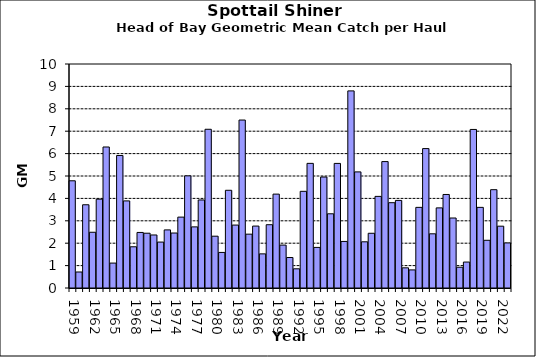
| Category | Series 0 |
|---|---|
| 1959.0 | 4.786 |
| 1960.0 | 0.715 |
| 1961.0 | 3.716 |
| 1962.0 | 2.489 |
| 1963.0 | 3.967 |
| 1964.0 | 6.295 |
| 1965.0 | 1.112 |
| 1966.0 | 5.916 |
| 1967.0 | 3.888 |
| 1968.0 | 1.84 |
| 1969.0 | 2.48 |
| 1970.0 | 2.446 |
| 1971.0 | 2.367 |
| 1972.0 | 2.05 |
| 1973.0 | 2.594 |
| 1974.0 | 2.455 |
| 1975.0 | 3.164 |
| 1976.0 | 5.007 |
| 1977.0 | 2.728 |
| 1978.0 | 3.93 |
| 1979.0 | 7.086 |
| 1980.0 | 2.313 |
| 1981.0 | 1.588 |
| 1982.0 | 4.362 |
| 1983.0 | 2.809 |
| 1984.0 | 7.498 |
| 1985.0 | 2.404 |
| 1986.0 | 2.765 |
| 1987.0 | 1.524 |
| 1988.0 | 2.826 |
| 1989.0 | 4.191 |
| 1990.0 | 1.916 |
| 1991.0 | 1.361 |
| 1992.0 | 0.857 |
| 1993.0 | 4.316 |
| 1994.0 | 5.564 |
| 1995.0 | 1.812 |
| 1996.0 | 4.954 |
| 1997.0 | 3.313 |
| 1998.0 | 5.562 |
| 1999.0 | 2.079 |
| 2000.0 | 8.799 |
| 2001.0 | 5.183 |
| 2002.0 | 2.063 |
| 2003.0 | 2.443 |
| 2004.0 | 4.09 |
| 2005.0 | 5.644 |
| 2006.0 | 3.809 |
| 2007.0 | 3.91 |
| 2008.0 | 0.901 |
| 2009.0 | 0.808 |
| 2010.0 | 3.6 |
| 2011.0 | 6.224 |
| 2012.0 | 2.42 |
| 2013.0 | 3.577 |
| 2014.0 | 4.175 |
| 2015.0 | 3.125 |
| 2016.0 | 0.927 |
| 2017.0 | 1.158 |
| 2018.0 | 7.078 |
| 2019.0 | 3.6 |
| 2020.0 | 2.13 |
| 2021.0 | 4.389 |
| 2022.0 | 2.76 |
| 2023.0 | 2.013 |